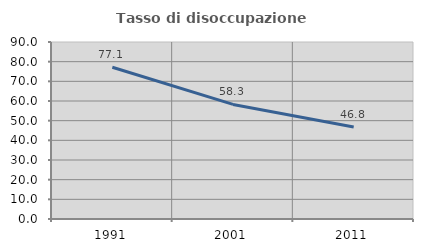
| Category | Tasso di disoccupazione giovanile  |
|---|---|
| 1991.0 | 77.143 |
| 2001.0 | 58.268 |
| 2011.0 | 46.753 |